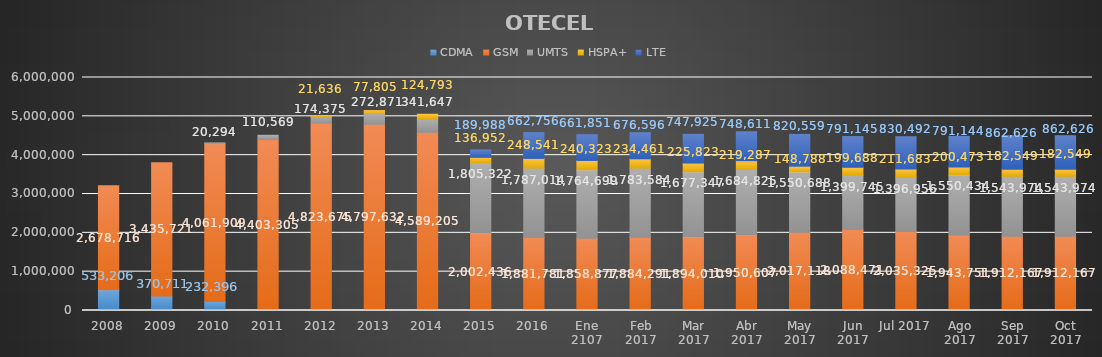
| Category | CDMA | GSM | UMTS | HSPA+ | LTE |
|---|---|---|---|---|---|
| 2008 | 533206 | 2678716 | 0 | 0 | 0 |
| 2009 | 370711 | 3435721 | 0 | 0 | 0 |
| 2010 | 232396 | 4061909 | 20294 | 0 | 0 |
| 2011 | 0 | 4403305 | 110569 | 0 | 0 |
| 2012 | 0 | 4823675 | 174375 | 21636 | 0 |
| 2013 | 0 | 4797632 | 272871 | 77805 | 0 |
| 2014 | 0 | 4589205 | 341647 | 124793 | 0 |
| 2015 | 0 | 2002436 | 1805322 | 136952 | 189988 |
| 2016 | 0 | 1881781 | 1787014 | 248541 | 662756 |
| Ene 2107 | 0 | 1858877 | 1764699 | 240323 | 661851 |
| Feb 2017 | 0 | 1884291 | 1783584 | 234461 | 676596 |
| Mar 2017 | 0 | 1894010 | 1677347 | 225823 | 747925 |
| Abr 2017 | 0 | 1950607 | 1684825 | 219287 | 748611 |
| May 2017 | 0 | 2017118 | 1550688 | 148788 | 820559 |
| Jun 2017 | 0 | 2088471 | 1399745 | 199688 | 791145 |
| Jul 2017 | 0 | 2035325 | 1396956 | 211683 | 830492 |
| Ago 2017 | 0 | 1943751 | 1550434 | 200473 | 791144 |
| Sep 2017 | 0 | 1912167 | 1543974 | 182549 | 862626 |
| Oct 2017 | 0 | 1912167 | 1543974 | 182549 | 862626 |